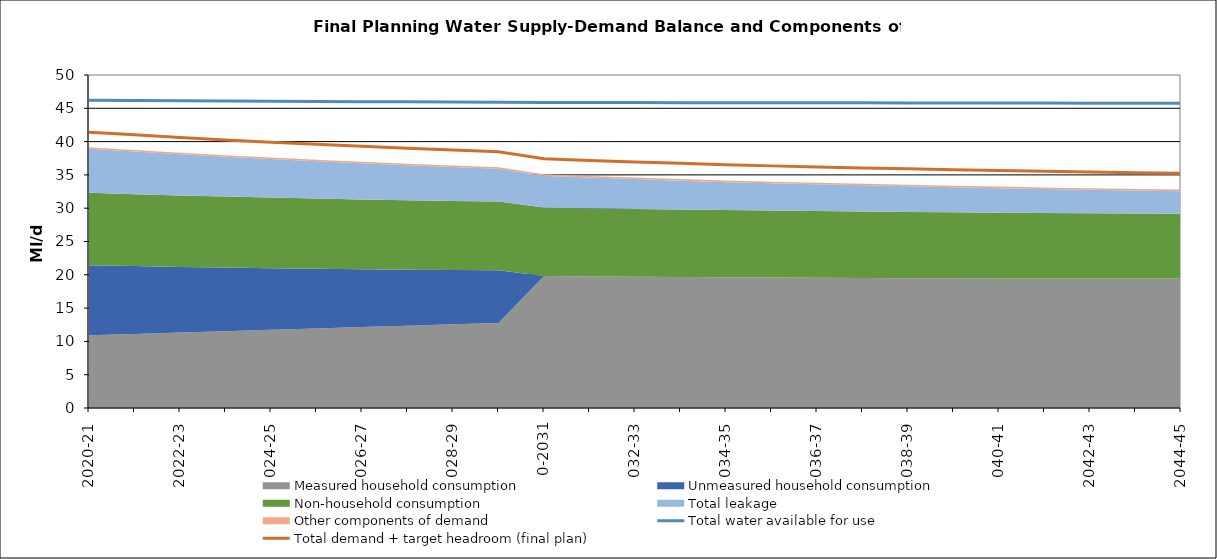
| Category | Total water available for use | Total demand + target headroom (final plan) |
|---|---|---|
| 0 | 46.199 | 41.421 |
| 1 | 46.166 | 41.013 |
| 2 | 46.132 | 40.624 |
| 3 | 46.099 | 40.256 |
| 4 | 46.066 | 39.903 |
| 5 | 46.033 | 39.591 |
| 6 | 45.999 | 39.294 |
| 7 | 45.966 | 39.011 |
| 8 | 45.933 | 38.742 |
| 9 | 45.899 | 38.486 |
| 10 | 45.874 | 37.433 |
| 11 | 45.866 | 37.18 |
| 12 | 45.858 | 36.952 |
| 13 | 45.849 | 36.731 |
| 14 | 45.841 | 36.515 |
| 15 | 45.832 | 36.355 |
| 16 | 45.824 | 36.2 |
| 17 | 45.816 | 36.052 |
| 18 | 45.808 | 35.91 |
| 19 | 45.799 | 35.774 |
| 20 | 45.791 | 35.656 |
| 21 | 45.783 | 35.543 |
| 22 | 45.774 | 35.439 |
| 23 | 45.766 | 35.334 |
| 24 | 45.758 | 35.233 |